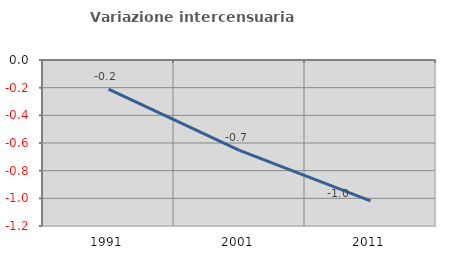
| Category | Variazione intercensuaria annua |
|---|---|
| 1991.0 | -0.211 |
| 2001.0 | -0.653 |
| 2011.0 | -1.018 |